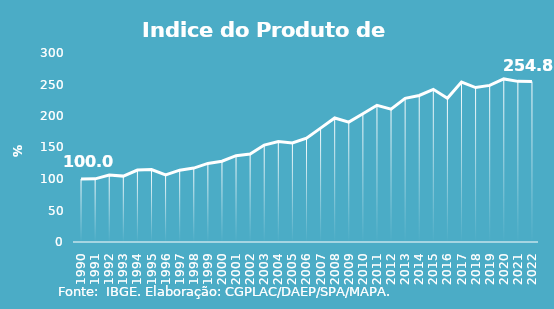
| Category | Indice de Prod. base 1990 |
|---|---|
| 1990.0 | 100 |
| 1991.0 | 100.275 |
| 1992.0 | 106.203 |
| 1993.0 | 104.57 |
| 1994.0 | 114.164 |
| 1995.0 | 115.024 |
| 1996.0 | 106.552 |
| 1997.0 | 114.037 |
| 1998.0 | 117.319 |
| 1999.0 | 124.734 |
| 2000.0 | 128.293 |
| 2001.0 | 136.975 |
| 2002.0 | 139.51 |
| 2003.0 | 153.868 |
| 2004.0 | 159.641 |
| 2005.0 | 157.136 |
| 2006.0 | 164.858 |
| 2007.0 | 180.781 |
| 2008.0 | 196.91 |
| 2009.0 | 190.309 |
| 2010.0 | 203.581 |
| 2011.0 | 217.041 |
| 2012.0 | 210.932 |
| 2013.0 | 228.009 |
| 2014.0 | 232.562 |
| 2015.0 | 242.318 |
| 2016.0 | 228.239 |
| 2017.0 | 253.826 |
| 2018.0 | 245.134 |
| 2019.0 | 248.619 |
| 2020.0 | 258.848 |
| 2021.0 | 254.988 |
| 2022.0 | 254.778 |